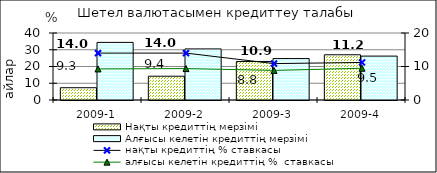
| Category | Нақты кредиттің мерзімі  | Алғысы келетін кредиттің мерзімі  |
|---|---|---|
| 2009-1 | 7.33 | 34.39 |
| 2009-2 | 14.2 | 30.5 |
| 2009-3 | 23 | 24.73 |
| 2009-4 | 27 | 26.21 |